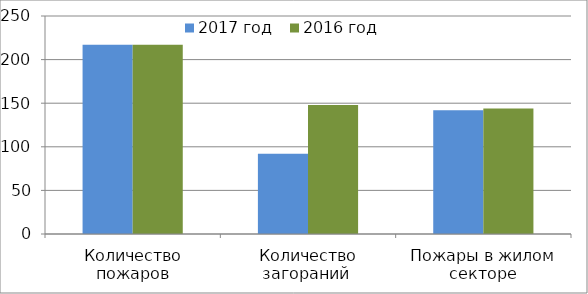
| Category | 2017 год | 2016 год |
|---|---|---|
| Количество пожаров | 217 | 217 |
| Количество загораний  | 92 | 148 |
| Пожары в жилом секторе | 142 | 144 |